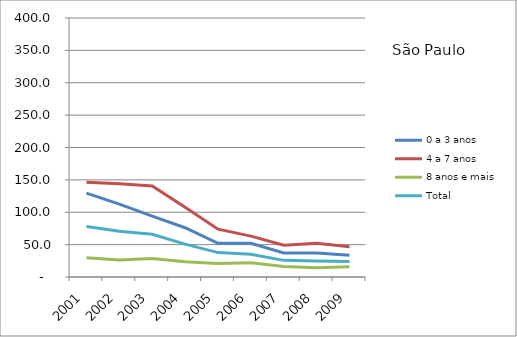
| Category | 0 a 3 anos | 4 a 7 anos | 8 anos e mais | Total |
|---|---|---|---|---|
| 2001.0 | 129.6 | 146.4 | 29.6 | 78 |
| 2002.0 | 112.6 | 144.1 | 26.1 | 70.8 |
| 2003.0 | 94.1 | 140.7 | 28.4 | 65.9 |
| 2004.0 | 76.1 | 107.8 | 23.5 | 50.8 |
| 2005.0 | 52.1 | 73.9 | 20.8 | 37.7 |
| 2006.0 | 52 | 63.1 | 22.1 | 35.1 |
| 2007.0 | 37.2 | 49 | 16.4 | 25.7 |
| 2008.0 | 37.2 | 52.3 | 14.4 | 24.9 |
| 2009.0 | 33.5 | 46.8 | 15.8 | 24.1 |